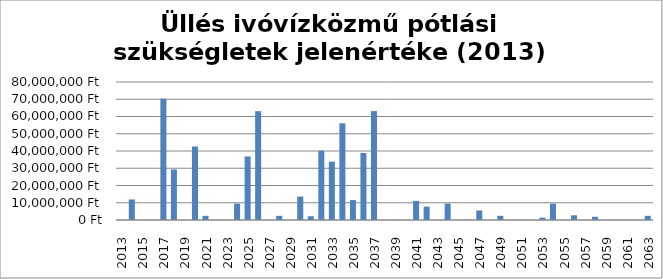
| Category | Series 0 |
|---|---|
| 2013.0 | 0 |
| 2014.0 | 11900100 |
| 2015.0 | 0 |
| 2016.0 | 0 |
| 2017.0 | 70346000 |
| 2018.0 | 29298000 |
| 2019.0 | 0 |
| 2020.0 | 42610000 |
| 2021.0 | 2419000 |
| 2022.0 | 0 |
| 2023.0 | 0 |
| 2024.0 | 9481100 |
| 2025.0 | 36820000 |
| 2026.0 | 63074000 |
| 2027.0 | 0 |
| 2028.0 | 2419000 |
| 2029.0 | 0 |
| 2030.0 | 13585000 |
| 2031.0 | 2190000 |
| 2032.0 | 40144000 |
| 2033.0 | 33812000 |
| 2034.0 | 56036100 |
| 2035.0 | 11553000 |
| 2036.0 | 38842500 |
| 2037.0 | 63137000 |
| 2038.0 | 0 |
| 2039.0 | 0 |
| 2040.0 | 0 |
| 2041.0 | 11058000 |
| 2042.0 | 7739000 |
| 2043.0 | 0 |
| 2044.0 | 9481100 |
| 2045.0 | 0 |
| 2046.0 | 228000 |
| 2047.0 | 5508000 |
| 2048.0 | 0 |
| 2049.0 | 2419000 |
| 2050.0 | 0 |
| 2051.0 | 0 |
| 2052.0 | 0 |
| 2053.0 | 1345500 |
| 2054.0 | 9481100 |
| 2055.0 | 0 |
| 2056.0 | 2723000 |
| 2057.0 | 0 |
| 2058.0 | 1881000 |
| 2059.0 | 0 |
| 2060.0 | 0 |
| 2061.0 | 0 |
| 2062.0 | 0 |
| 2063.0 | 2419000 |